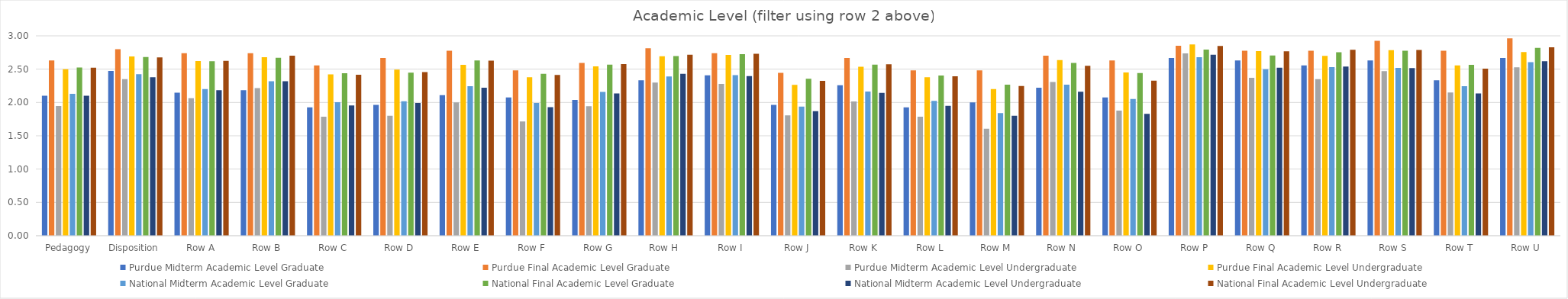
| Category | Purdue | National |
|---|---|---|
| Pedagogy | 2.499 | 2.523 |
| Disposition | 2.691 | 2.676 |
| Row A | 2.621 | 2.626 |
| Row B | 2.679 | 2.702 |
| Row C | 2.421 | 2.417 |
| Row D | 2.493 | 2.456 |
| Row E | 2.564 | 2.629 |
| Row F | 2.379 | 2.412 |
| Row G | 2.543 | 2.577 |
| Row H | 2.693 | 2.716 |
| Row I | 2.714 | 2.73 |
| Row J | 2.264 | 2.324 |
| Row K | 2.536 | 2.574 |
| Row L | 2.379 | 2.392 |
| Row M | 2.2 | 2.248 |
| Row N | 2.636 | 2.551 |
| Row O | 2.45 | 2.326 |
| Row P | 2.871 | 2.847 |
| Row Q | 2.771 | 2.769 |
| Row R | 2.7 | 2.79 |
| Row S | 2.786 | 2.788 |
| Row T | 2.557 | 2.509 |
| Row U | 2.757 | 2.829 |